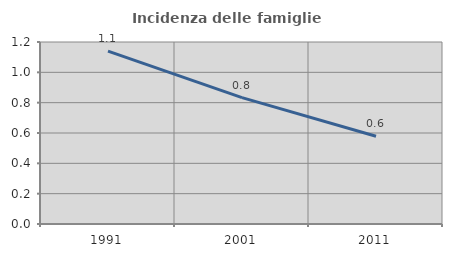
| Category | Incidenza delle famiglie numerose |
|---|---|
| 1991.0 | 1.14 |
| 2001.0 | 0.833 |
| 2011.0 | 0.578 |